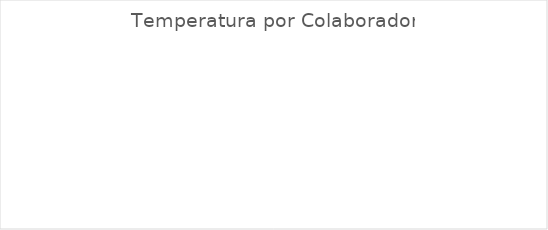
| Category | Temperatura Cº |
|---|---|
| 0 | 38.6 |
| 1 | 35.4 |
| 2 | 36.4 |
| 3 | 36.7 |
| 4 | 38.7 |
| 5 | 36 |
| 6 | 36.1 |
| 7 | 35.9 |
| 8 | 36.2 |
| 9 | 36.4 |
| 10 | 36.1 |
| 11 | 37.2 |
| 12 | 36.4 |
| 13 | 35.8 |
| 14 | 36.1 |
| 15 | 36.5 |
| 16 | 36.2 |
| 17 | 35.9 |